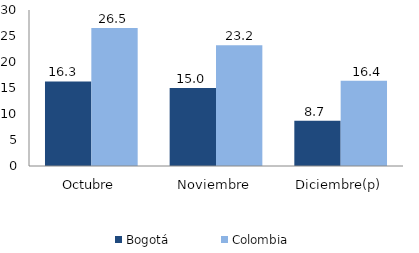
| Category | Bogotá | Colombia |
|---|---|---|
| Octubre | 16.266 | 26.541 |
| Noviembre | 14.999 | 23.228 |
| Diciembre(p) | 8.681 | 16.416 |